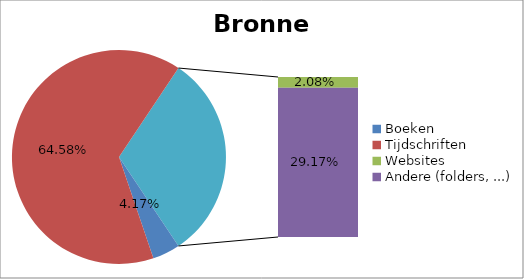
| Category | Series 0 |
|---|---|
| Boeken | 0.042 |
| Tijdschriften | 0.646 |
| Websites | 0.021 |
| Andere (folders, ...) | 0.292 |